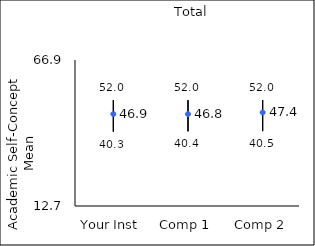
| Category | 25th percentile | 75th percentile | Mean |
|---|---|---|---|
| Your Inst | 40.3 | 52 | 46.85 |
| Comp 1 | 40.4 | 52 | 46.84 |
| Comp 2 | 40.5 | 52 | 47.43 |